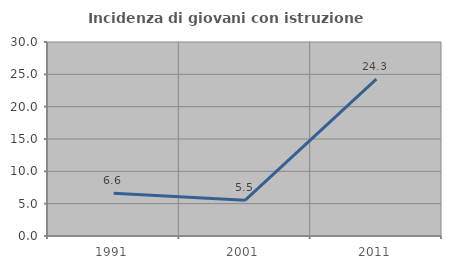
| Category | Incidenza di giovani con istruzione universitaria |
|---|---|
| 1991.0 | 6.608 |
| 2001.0 | 5.512 |
| 2011.0 | 24.257 |